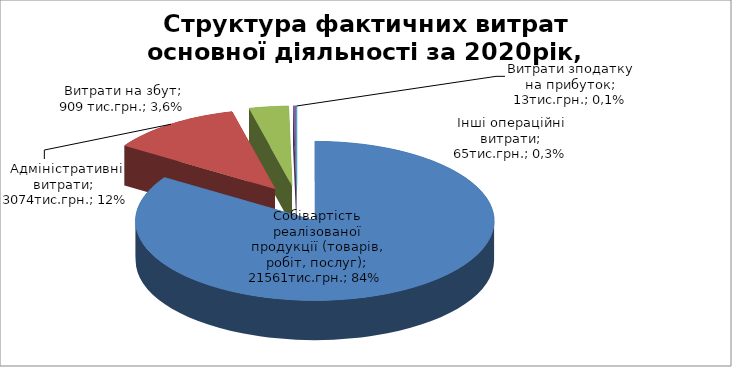
| Category | Series 0 |
|---|---|
| Собівартість реалізованої продукції (товарів, робіт, послуг) | 21561 |
| Адміністративні витрати | 3074 |
| Витрати на збут | 909 |
| Інші операційні витрати | 65 |
| Витрати зподатку на прибуток | 13 |